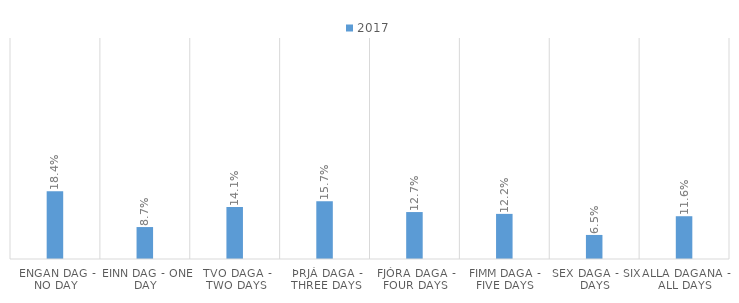
| Category | 2017 |
|---|---|
| Engan dag - No day | 0.184 |
| Einn dag - One day | 0.087 |
| Tvo daga - Two days | 0.141 |
| Þrjá daga - Three days | 0.157 |
| Fjóra daga - Four days | 0.127 |
| Fimm daga - Five days | 0.122 |
| Sex daga - Six days | 0.065 |
| Alla dagana - All days | 0.116 |